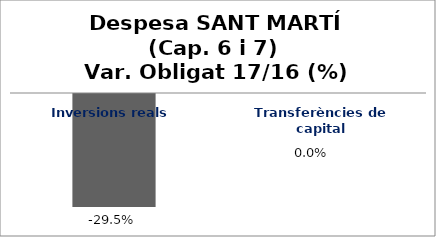
| Category | Series 0 |
|---|---|
| Inversions reals | -0.295 |
| Transferències de capital | 0 |